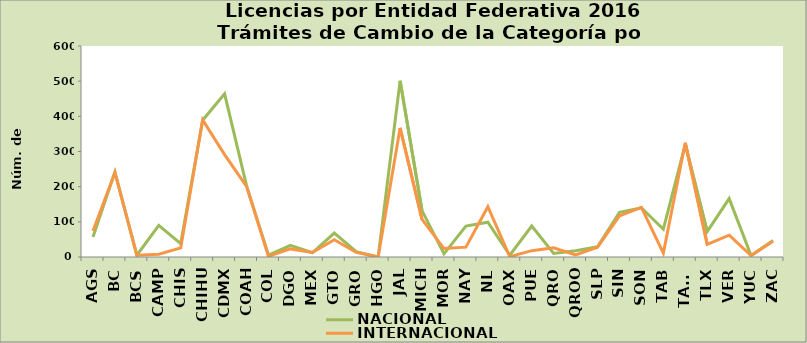
| Category | NACIONAL | INTERNACIONAL |
|---|---|---|
| AGS | 57 | 74 |
| BC | 242 | 240 |
| BCS | 5 | 5 |
| CAMP | 90 | 8 |
| CHIS | 38 | 26 |
| CHIHU | 389 | 390 |
| CDMX | 464 | 291 |
| COAH | 203 | 201 |
| COL | 5 | 2 |
| DGO | 33 | 23 |
| MEX | 12 | 13 |
| GTO | 68 | 49 |
| GRO | 15 | 13 |
| HGO | 0 | 0 |
| JAL | 501 | 367 |
| MICH | 132 | 107 |
| MOR | 9 | 24 |
| NAY | 88 | 28 |
| NL | 99 | 143 |
| OAX | 5 | 1 |
| PUE | 88 | 18 |
| QRO | 10 | 26 |
| QROO | 18 | 6 |
| SLP | 29 | 28 |
| SIN | 127 | 117 |
| SON | 140 | 141 |
| TAB | 79 | 11 |
| TAMS | 320 | 325 |
| TLX | 72 | 36 |
| VER | 166 | 62 |
| YUC | 4 | 4 |
| ZAC | 47 | 45 |